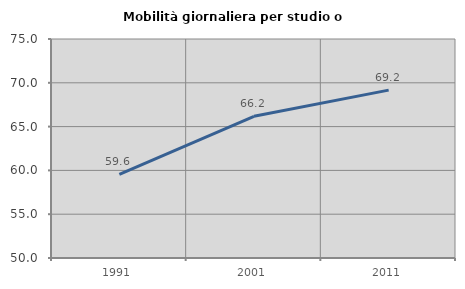
| Category | Mobilità giornaliera per studio o lavoro |
|---|---|
| 1991.0 | 59.555 |
| 2001.0 | 66.181 |
| 2011.0 | 69.167 |